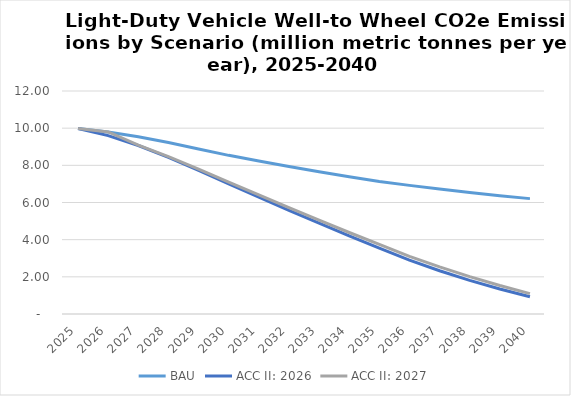
| Category | BAU | ACC II: 2026 | ACC II: 2027 |
|---|---|---|---|
| 2025.0 | 9.983 | 9.983 | 9.983 |
| 2026.0 | 9.794 | 9.601 | 9.794 |
| 2027.0 | 9.541 | 9.065 | 9.086 |
| 2028.0 | 9.228 | 8.427 | 8.472 |
| 2029.0 | 8.878 | 7.723 | 7.794 |
| 2030.0 | 8.537 | 7.003 | 7.099 |
| 2031.0 | 8.238 | 6.29 | 6.414 |
| 2032.0 | 7.942 | 5.575 | 5.724 |
| 2033.0 | 7.658 | 4.888 | 5.056 |
| 2034.0 | 7.386 | 4.2 | 4.385 |
| 2035.0 | 7.131 | 3.549 | 3.746 |
| 2036.0 | 6.921 | 2.901 | 3.105 |
| 2037.0 | 6.725 | 2.328 | 2.533 |
| 2038.0 | 6.541 | 1.812 | 2.012 |
| 2039.0 | 6.369 | 1.347 | 1.535 |
| 2040.0 | 6.209 | 0.927 | 1.098 |